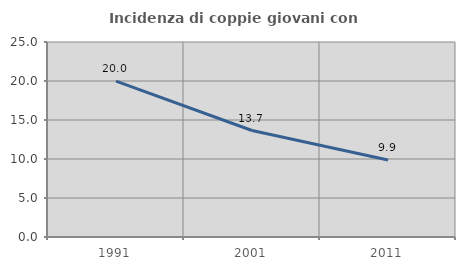
| Category | Incidenza di coppie giovani con figli |
|---|---|
| 1991.0 | 19.974 |
| 2001.0 | 13.651 |
| 2011.0 | 9.881 |